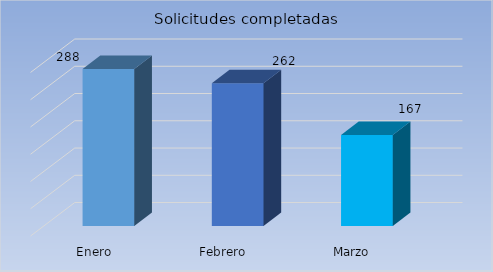
| Category | Cantidad |
|---|---|
| Enero | 288 |
| Febrero | 262 |
| Marzo | 167 |